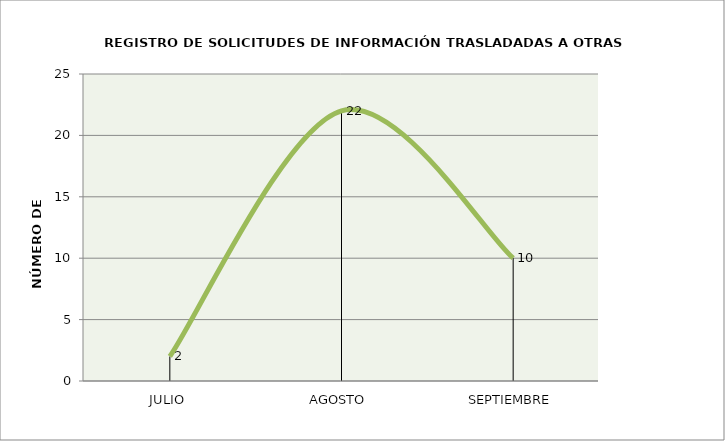
| Category | Series 0 |
|---|---|
| JULIO | 2 |
| AGOSTO | 22 |
| SEPTIEMBRE | 10 |